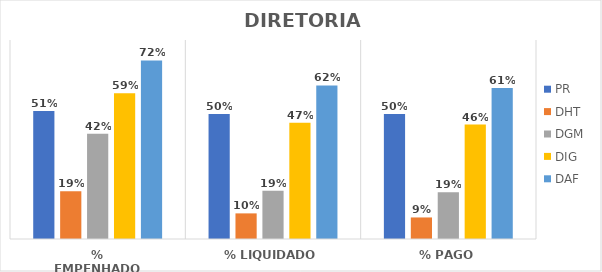
| Category | PR | DHT | DGM | DIG | DAF |
|---|---|---|---|---|---|
| % EMPENHADO | 0.515 | 0.192 | 0.423 | 0.586 | 0.718 |
| % LIQUIDADO | 0.503 | 0.103 | 0.194 | 0.467 | 0.617 |
| % PAGO | 0.503 | 0.087 | 0.188 | 0.46 | 0.607 |